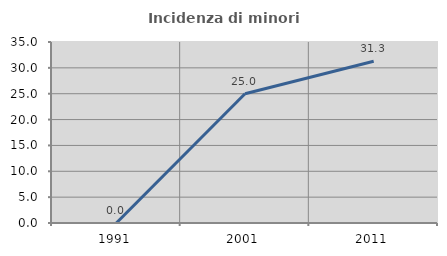
| Category | Incidenza di minori stranieri |
|---|---|
| 1991.0 | 0 |
| 2001.0 | 25 |
| 2011.0 | 31.281 |